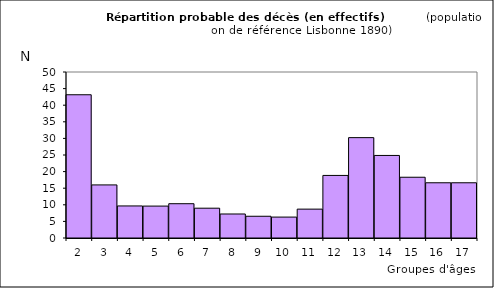
| Category | Series 0 |
|---|---|
| 2.0 | 43.145 |
| 3.0 | 15.99 |
| 4.0 | 9.656 |
| 5.0 | 9.611 |
| 6.0 | 10.329 |
| 7.0 | 8.976 |
| 8.0 | 7.233 |
| 9.0 | 6.551 |
| 10.0 | 6.3 |
| 11.0 | 8.696 |
| 12.0 | 18.847 |
| 13.0 | 30.232 |
| 14.0 | 24.864 |
| 15.0 | 18.3 |
| 16.0 | 16.634 |
| 17.0 | 16.634 |